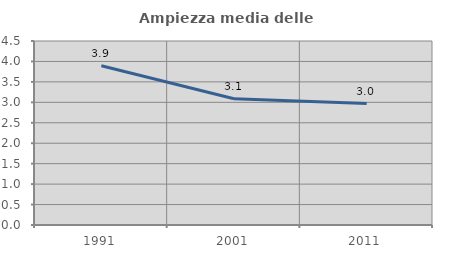
| Category | Ampiezza media delle famiglie |
|---|---|
| 1991.0 | 3.894 |
| 2001.0 | 3.089 |
| 2011.0 | 2.971 |